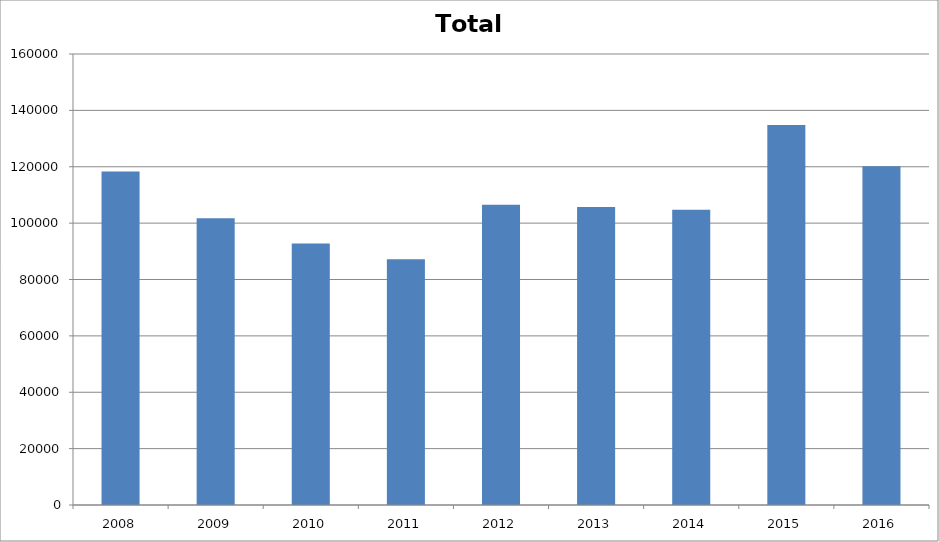
| Category | Total |
|---|---|
| 2008.0 | 118293 |
| 2009.0 | 101764 |
| 2010.0 | 92778 |
| 2011.0 | 87140 |
| 2012.0 | 106546 |
| 2013.0 | 105679 |
| 2014.0 | 104724 |
| 2015.0 | 134819 |
| 2016.0 | 120183 |